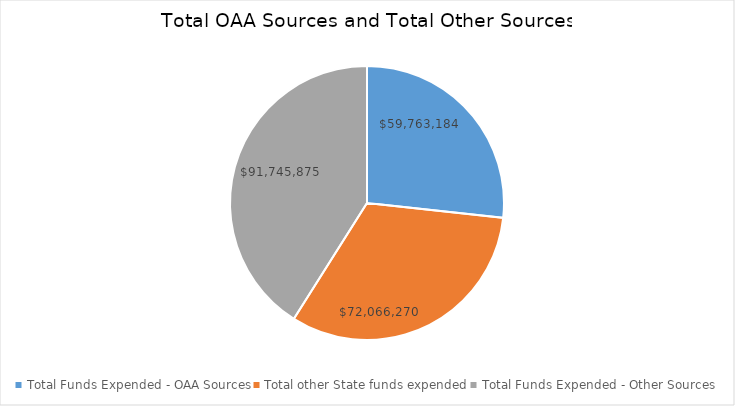
| Category | Series 0 |
|---|---|
| Total Funds Expended - OAA Sources | 59763183.93 |
| Total other State funds expended | 72066269.99 |
| Total Funds Expended - Other Sources | 91745874.9 |